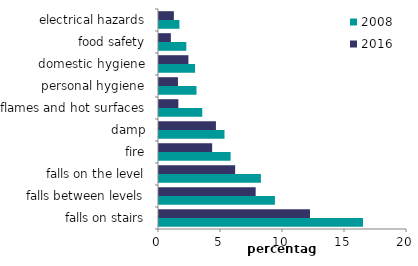
| Category | 2008 | 2016 |
|---|---|---|
| falls on stairs | 16.45 | 12.176 |
| falls between levels | 9.349 | 7.796 |
| falls on the level | 8.218 | 6.142 |
| fire | 5.775 | 4.287 |
| damp | 5.283 | 4.591 |
| flames and hot surfaces | 3.489 | 1.56 |
| personal hygiene | 3.023 | 1.529 |
| domestic hygiene | 2.909 | 2.373 |
| food safety | 2.2 | 0.957 |
| electrical hazards | 1.646 | 1.198 |